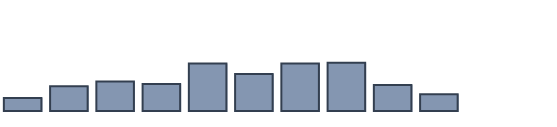
| Category | Series 0 |
|---|---|
| 0 | 4.1 |
| 1 | 7.8 |
| 2 | 9.3 |
| 3 | 8.5 |
| 4 | 15 |
| 5 | 11.7 |
| 6 | 15 |
| 7 | 15.2 |
| 8 | 8.2 |
| 9 | 5.3 |
| 10 | 0 |
| 11 | 0 |